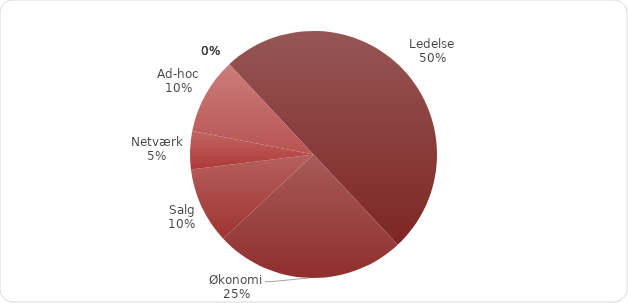
| Category | % |
|---|---|
| Ledelse | 50 |
| Økonomi | 25 |
| Salg | 10 |
| Netværk | 5 |
| Ad-hoc | 10 |